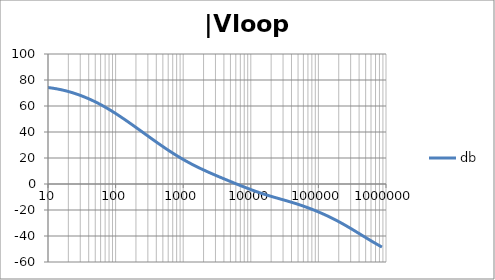
| Category | db |
|---|---|
| 1.0 | 75.841 |
| 1.0715193052376064 | 75.838 |
| 1.1481536214968828 | 75.834 |
| 1.2302687708123814 | 75.831 |
| 1.318256738556407 | 75.826 |
| 1.4125375446227544 | 75.821 |
| 1.513561248436208 | 75.815 |
| 1.6218100973589298 | 75.809 |
| 1.7378008287493754 | 75.801 |
| 1.8620871366628673 | 75.793 |
| 1.9952623149688797 | 75.783 |
| 2.1379620895022318 | 75.771 |
| 2.2908676527677727 | 75.758 |
| 2.45470891568503 | 75.744 |
| 2.6302679918953817 | 75.727 |
| 2.8183829312644537 | 75.707 |
| 3.0199517204020156 | 75.685 |
| 3.235936569296282 | 75.659 |
| 3.467368504525316 | 75.63 |
| 3.7153522909717256 | 75.597 |
| 3.9810717055349727 | 75.559 |
| 4.265795188015926 | 75.516 |
| 4.570881896148749 | 75.468 |
| 4.897788193684462 | 75.412 |
| 5.2480746024977245 | 75.349 |
| 5.62341325190349 | 75.278 |
| 6.025595860743575 | 75.197 |
| 6.456542290346554 | 75.106 |
| 6.918309709189363 | 75.004 |
| 7.4131024130091765 | 74.889 |
| 7.943282347242814 | 74.76 |
| 8.511380382023765 | 74.616 |
| 9.120108393559095 | 74.456 |
| 9.772372209558105 | 74.278 |
| 10.47128548050899 | 74.082 |
| 11.22018454301963 | 73.865 |
| 12.022644346174127 | 73.627 |
| 12.88249551693134 | 73.368 |
| 13.803842646028851 | 73.085 |
| 14.791083881682074 | 72.778 |
| 15.848931924611136 | 72.446 |
| 16.98243652461744 | 72.09 |
| 18.197008586099834 | 71.708 |
| 19.498445997580447 | 71.301 |
| 20.892961308540382 | 70.868 |
| 22.387211385683386 | 70.409 |
| 23.988329190194897 | 69.925 |
| 25.703957827688622 | 69.414 |
| 27.54228703338165 | 68.878 |
| 29.51209226666385 | 68.317 |
| 31.62277660168379 | 67.73 |
| 33.884415613920254 | 67.118 |
| 36.307805477010106 | 66.481 |
| 38.90451449942804 | 65.818 |
| 41.686938347033525 | 65.129 |
| 44.6683592150963 | 64.415 |
| 47.86300923226381 | 63.676 |
| 51.28613839913647 | 62.91 |
| 54.95408738576247 | 62.119 |
| 58.88436553555889 | 61.303 |
| 63.09573444801931 | 60.462 |
| 67.60829753919813 | 59.596 |
| 72.44359600749901 | 58.706 |
| 77.62471166286915 | 57.792 |
| 83.17637711026705 | 56.856 |
| 89.12509381337456 | 55.898 |
| 95.49925860214357 | 54.92 |
| 102.32929922807544 | 53.922 |
| 109.64781961431841 | 52.907 |
| 117.48975549395293 | 51.875 |
| 125.89254117941665 | 50.827 |
| 134.89628825916537 | 49.766 |
| 144.54397707459273 | 48.693 |
| 154.88166189124806 | 47.609 |
| 165.95869074375608 | 46.515 |
| 177.82794100389225 | 45.413 |
| 190.5460717963248 | 44.304 |
| 204.17379446695278 | 43.19 |
| 218.77616239495524 | 42.072 |
| 234.42288153199212 | 40.95 |
| 251.18864315095806 | 39.827 |
| 269.15348039269156 | 38.703 |
| 288.4031503126605 | 37.58 |
| 309.0295432513591 | 36.459 |
| 331.1311214825911 | 35.341 |
| 354.81338923357566 | 34.227 |
| 380.18939632056095 | 33.119 |
| 407.3802778041123 | 32.017 |
| 436.5158322401654 | 30.924 |
| 467.7351412871979 | 29.84 |
| 501.18723362727184 | 28.766 |
| 537.0317963702526 | 27.705 |
| 575.4399373371566 | 26.657 |
| 616.5950018614822 | 25.623 |
| 660.6934480075952 | 24.605 |
| 707.9457843841375 | 23.603 |
| 758.5775750291831 | 22.619 |
| 812.8305161640983 | 21.654 |
| 870.9635899560801 | 20.708 |
| 933.2543007969903 | 19.782 |
| 999.9999999999998 | 18.875 |
| 1071.5193052376057 | 17.989 |
| 1148.1536214968828 | 17.123 |
| 1230.2687708123801 | 16.276 |
| 1318.2567385564053 | 15.449 |
| 1412.537544622753 | 14.64 |
| 1513.5612484362066 | 13.849 |
| 1621.8100973589292 | 13.075 |
| 1737.8008287493742 | 12.317 |
| 1862.0871366628671 | 11.573 |
| 1995.2623149688786 | 10.843 |
| 2137.9620895022326 | 10.125 |
| 2290.867652767771 | 9.418 |
| 2454.708915685027 | 8.722 |
| 2630.26799189538 | 8.034 |
| 2818.382931264451 | 7.355 |
| 3019.9517204020176 | 6.682 |
| 3235.9365692962774 | 6.016 |
| 3467.368504525316 | 5.355 |
| 3715.352290971724 | 4.699 |
| 3981.07170553497 | 4.047 |
| 4265.795188015923 | 3.399 |
| 4570.881896148745 | 2.753 |
| 4897.788193684463 | 2.111 |
| 5248.074602497726 | 1.472 |
| 5623.413251903489 | 0.836 |
| 6025.595860743574 | 0.203 |
| 6456.54229034655 | -0.427 |
| 6918.309709189357 | -1.052 |
| 7413.102413009165 | -1.672 |
| 7943.282347242815 | -2.287 |
| 8511.380382023763 | -2.895 |
| 9120.108393559092 | -3.495 |
| 9772.3722095581 | -4.086 |
| 10471.285480509003 | -4.667 |
| 11220.184543019639 | -5.237 |
| 12022.64434617411 | -5.795 |
| 12882.495516931338 | -6.34 |
| 13803.842646028841 | -6.872 |
| 14791.083881682063 | -7.391 |
| 15848.931924611119 | -7.896 |
| 16982.436524617453 | -8.389 |
| 18197.008586099837 | -8.869 |
| 19498.445997580417 | -9.339 |
| 20892.961308540387 | -9.8 |
| 22387.211385683382 | -10.253 |
| 23988.32919019488 | -10.701 |
| 25703.957827688606 | -11.145 |
| 27542.28703338167 | -11.588 |
| 29512.092266663854 | -12.032 |
| 31622.77660168378 | -12.478 |
| 33884.41561392023 | -12.93 |
| 36307.805477010166 | -13.387 |
| 38904.514499428085 | -13.853 |
| 41686.93834703348 | -14.328 |
| 44668.35921509631 | -14.814 |
| 47863.00923226382 | -15.311 |
| 51286.13839913646 | -15.821 |
| 54954.08738576241 | -16.344 |
| 58884.365535558936 | -16.88 |
| 63095.73444801934 | -17.43 |
| 67608.29753919817 | -17.994 |
| 72443.59600749899 | -18.572 |
| 77624.71166286913 | -19.165 |
| 83176.37711026703 | -19.774 |
| 89125.09381337445 | -20.397 |
| 95499.25860214363 | -21.036 |
| 102329.29922807543 | -21.692 |
| 109647.81961431848 | -22.364 |
| 117489.75549395289 | -23.053 |
| 125892.54117941685 | -23.759 |
| 134896.28825916522 | -24.483 |
| 144543.97707459255 | -25.225 |
| 154881.66189124787 | -25.986 |
| 165958.69074375575 | -26.766 |
| 177827.9410038922 | -27.564 |
| 190546.07179632425 | -28.381 |
| 204173.79446695274 | -29.217 |
| 218776.16239495497 | -30.07 |
| 234422.88153199226 | -30.941 |
| 251188.64315095753 | -31.827 |
| 269153.480392691 | -32.729 |
| 288403.15031266044 | -33.644 |
| 309029.5432513582 | -34.571 |
| 331131.1214825907 | -35.508 |
| 354813.3892335749 | -36.453 |
| 380189.3963205612 | -37.404 |
| 407380.2778041119 | -38.358 |
| 436515.8322401649 | -39.315 |
| 467735.14128719777 | -40.27 |
| 501187.2336272717 | -41.223 |
| 537031.7963702519 | -42.17 |
| 575439.9373371559 | -43.111 |
| 616595.001861482 | -44.042 |
| 660693.4480075944 | -44.963 |
| 707945.7843841374 | -45.871 |
| 758577.575029183 | -46.765 |
| 812830.5161640996 | -47.645 |
| 870963.5899560791 | -48.509 |